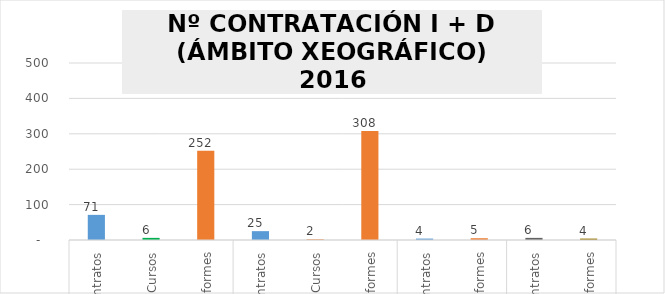
| Category | Series 0 |
|---|---|
| 0 | 71 |
| 1 | 6 |
| 2 | 252 |
| 3 | 25 |
| 4 | 2 |
| 5 | 308 |
| 6 | 4 |
| 7 | 5 |
| 8 | 6 |
| 9 | 4 |